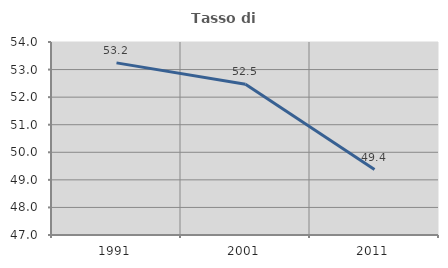
| Category | Tasso di occupazione   |
|---|---|
| 1991.0 | 53.242 |
| 2001.0 | 52.468 |
| 2011.0 | 49.375 |